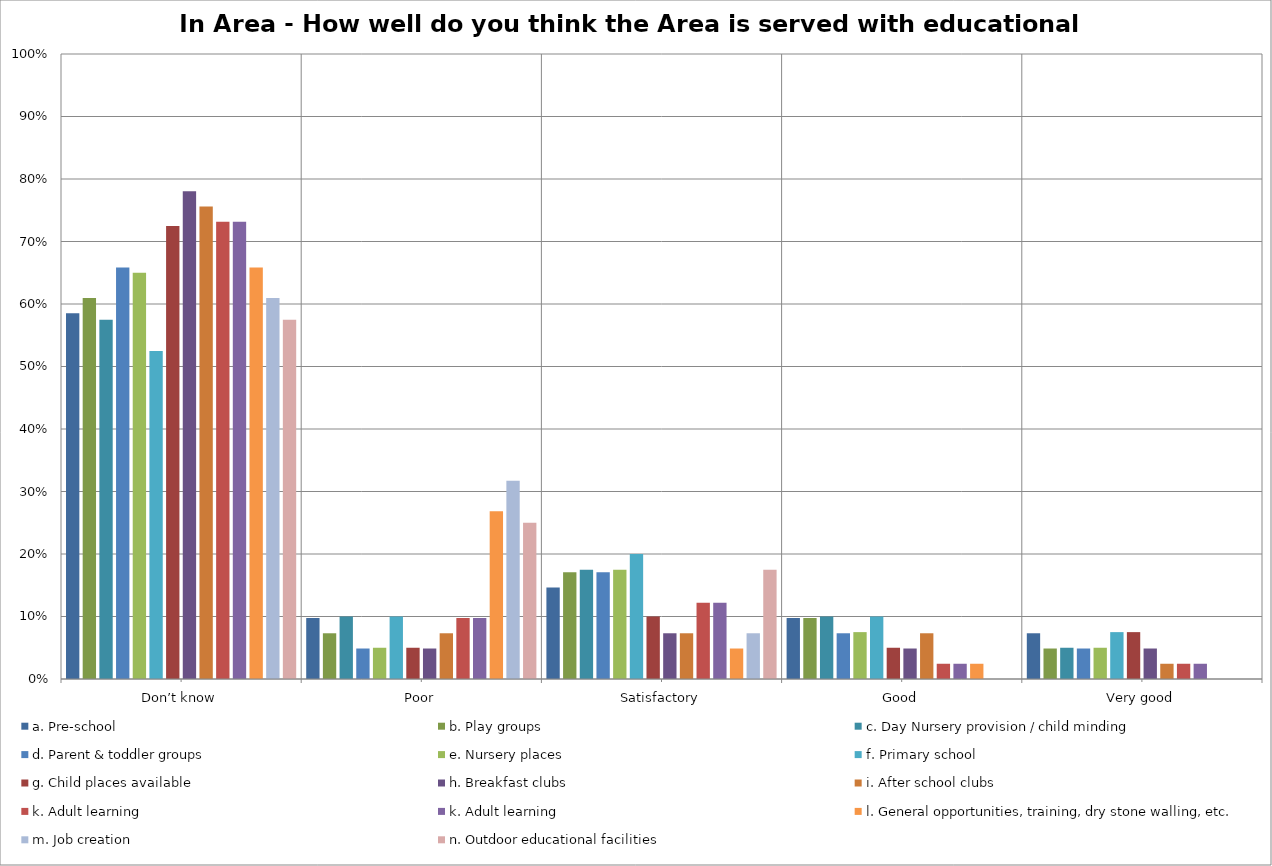
| Category | a. Pre-school | b. Play groups | c. Day Nursery provision / child minding | d. Parent & toddler groups | e. Nursery places | f. Primary school | g. Child places available | h. Breakfast clubs | i. After school clubs | k. Adult learning | l. General opportunities, training, dry stone walling, etc. | m. Job creation | n. Outdoor educational facilities |
|---|---|---|---|---|---|---|---|---|---|---|---|---|---|
| Don’t know | 0.585 | 0.61 | 0.575 | 0.659 | 0.65 | 0.525 | 0.725 | 0.78 | 0.756 | 0.732 | 0.659 | 0.61 | 0.575 |
| Poor | 0.098 | 0.073 | 0.1 | 0.049 | 0.05 | 0.1 | 0.05 | 0.049 | 0.073 | 0.098 | 0.268 | 0.317 | 0.25 |
| Satisfactory | 0.146 | 0.171 | 0.175 | 0.171 | 0.175 | 0.2 | 0.1 | 0.073 | 0.073 | 0.122 | 0.049 | 0.073 | 0.175 |
| Good | 0.098 | 0.098 | 0.1 | 0.073 | 0.075 | 0.1 | 0.05 | 0.049 | 0.073 | 0.024 | 0.024 | 0 | 0 |
| Very good | 0.073 | 0.049 | 0.05 | 0.049 | 0.05 | 0.075 | 0.075 | 0.049 | 0.024 | 0.024 | 0 | 0 | 0 |